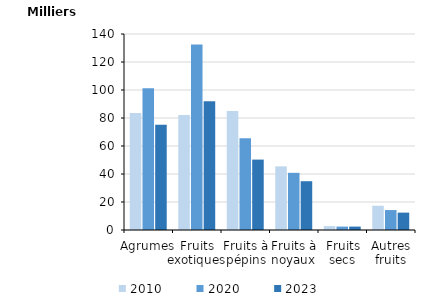
| Category | 2010 | 2020 | 2023 |
|---|---|---|---|
| Agrumes | 83614.11 | 101188.607 | 75134.544 |
| Fruits exotiques | 82180.96 | 132433.01 | 91975.36 |
| Fruits à pépins | 84950.72 | 65477.816 | 50294.034 |
| Fruits à noyaux | 45458.62 | 40837.087 | 34845.032 |
| Fruits secs | 2774.6 | 2434.357 | 2433.704 |
| Autres fruits | 17333.72 | 14247.833 | 12410.325 |